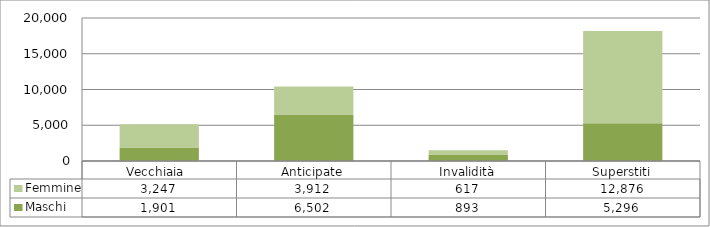
| Category | Maschi | Femmine |
|---|---|---|
| Vecchiaia  | 1901 | 3247 |
| Anticipate | 6502 | 3912 |
| Invalidità | 893 | 617 |
| Superstiti | 5296 | 12876 |